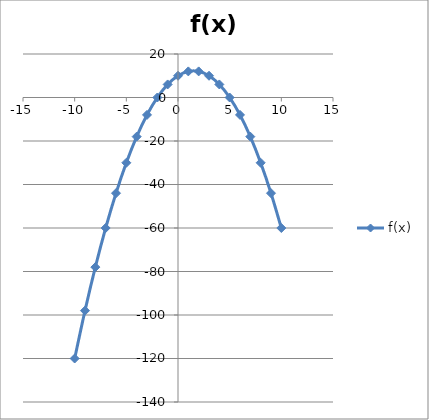
| Category | f(x) |
|---|---|
| -10.0 | -120 |
| -9.0 | -98 |
| -8.0 | -78 |
| -7.0 | -60 |
| -6.0 | -44 |
| -5.0 | -30 |
| -4.0 | -18 |
| -3.0 | -8 |
| -2.0 | 0 |
| -1.0 | 6 |
| 0.0 | 10 |
| 1.0 | 12 |
| 2.0 | 12 |
| 3.0 | 10 |
| 4.0 | 6 |
| 5.0 | 0 |
| 6.0 | -8 |
| 7.0 | -18 |
| 8.0 | -30 |
| 9.0 | -44 |
| 10.0 | -60 |